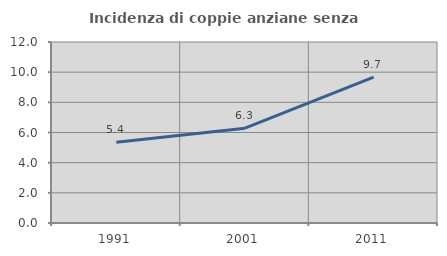
| Category | Incidenza di coppie anziane senza figli  |
|---|---|
| 1991.0 | 5.355 |
| 2001.0 | 6.289 |
| 2011.0 | 9.674 |